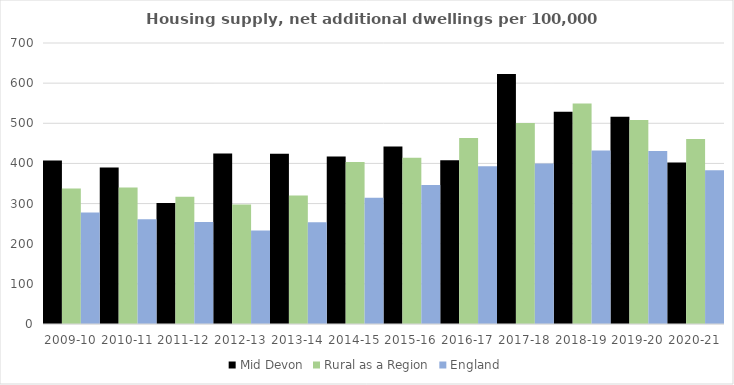
| Category | Mid Devon | Rural as a Region | England |
|---|---|---|---|
| 2009-10 | 407.373 | 337.852 | 277.548 |
| 2010-11 | 389.709 | 340.105 | 260.994 |
| 2011-12 | 301.529 | 317.04 | 254.007 |
| 2012-13 | 424.842 | 297.763 | 233.153 |
| 2013-14 | 424.364 | 319.835 | 253.602 |
| 2014-15 | 417.55 | 403.796 | 314.256 |
| 2015-16 | 442.311 | 414.091 | 346.154 |
| 2016-17 | 408.112 | 463.209 | 393.256 |
| 2017-18 | 622.651 | 500.68 | 399.646 |
| 2018-19 | 528.796 | 549.491 | 432.099 |
| 2019-20 | 516.334 | 508.493 | 431.187 |
| 2020-21 | 402.209 | 461.114 | 382.827 |